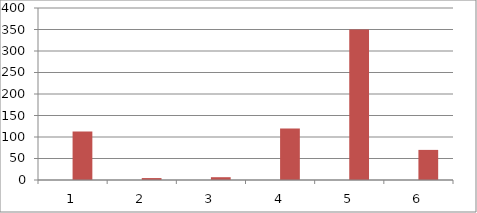
| Category | Series 0 | Series 1 |
|---|---|---|
| 0 | 0 | 113 |
| 1 | 0 | 4.5 |
| 2 | 0 | 6.5 |
| 3 | 0 | 120 |
| 4 | 0 | 350 |
| 5 | 0 | 70 |